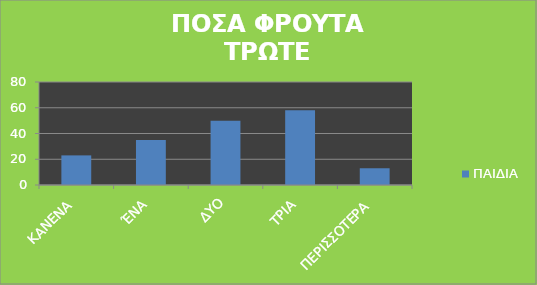
| Category | ΠΑΙΔΙΑ |
|---|---|
| ΚΑΝΕΝΑ | 23 |
| ΈΝΑ | 35 |
| ΔΥΟ | 50 |
| ΤΡΙΑ | 58 |
| ΠΕΡΙΣΣΟΤΕΡΑ | 13 |